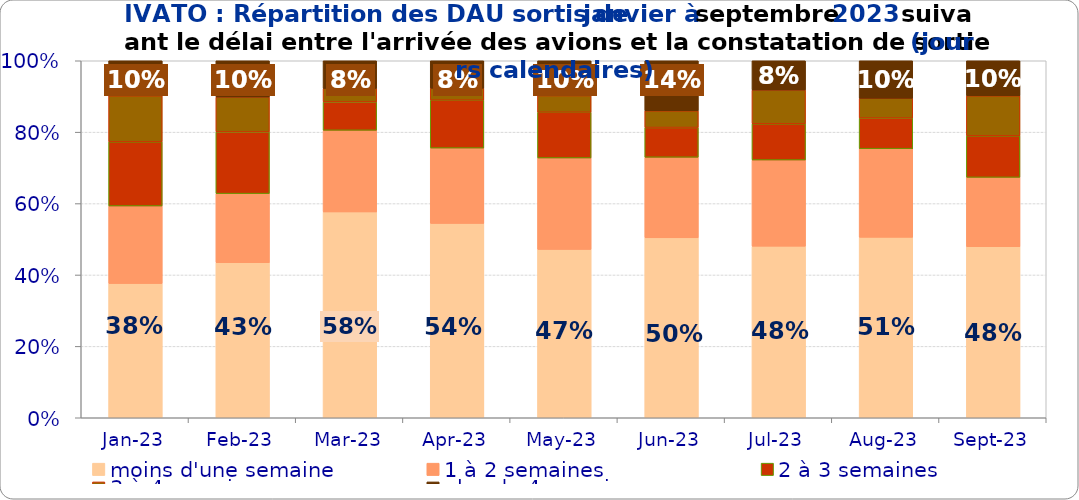
| Category | moins d'une semaine | 1 à 2 semaines | 2 à 3 semaines | 3 à 4 semaines | plus de 4 semaines |
|---|---|---|---|---|---|
| 2023-01-01 | 0.376 | 0.217 | 0.18 | 0.129 | 0.098 |
| 2023-02-01 | 0.434 | 0.194 | 0.173 | 0.098 | 0.102 |
| 2023-03-01 | 0.577 | 0.229 | 0.08 | 0.038 | 0.078 |
| 2023-04-01 | 0.544 | 0.211 | 0.134 | 0.034 | 0.077 |
| 2023-05-01 | 0.472 | 0.256 | 0.128 | 0.047 | 0.098 |
| 2023-06-01 | 0.504 | 0.226 | 0.083 | 0.047 | 0.14 |
| 2023-07-01 | 0.481 | 0.241 | 0.101 | 0.095 | 0.082 |
| 2023-08-01 | 0.505 | 0.248 | 0.086 | 0.056 | 0.105 |
| 2023-09-01 | 0.479 | 0.194 | 0.116 | 0.112 | 0.098 |